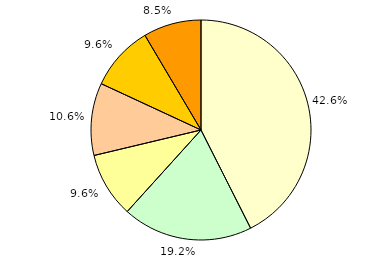
| Category | Series 0 |
|---|---|
| unter 3 Jahre | 40 |
| 3 bis unter 6 Jahre | 18 |
| 6 bis unter 9 Jahre | 9 |
| 9 bis unter 12 Jahre | 10 |
| 12 bis unter 15 Jahre | 9 |
| 15 bis unter 18 Jahre | 8 |